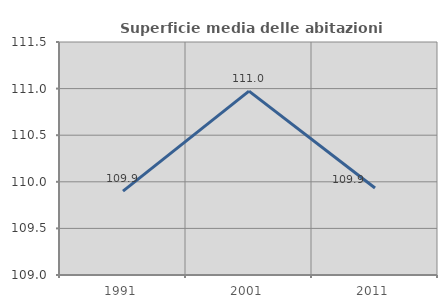
| Category | Superficie media delle abitazioni occupate |
|---|---|
| 1991.0 | 109.899 |
| 2001.0 | 110.973 |
| 2011.0 | 109.934 |